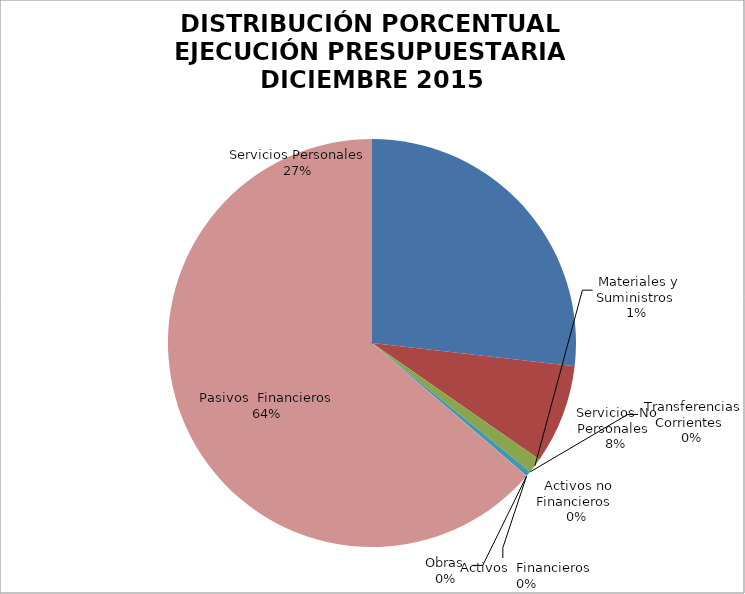
| Category | Series 0 | Series 1 |
|---|---|---|
| Servicios Personales | 19591606.44 | 0.268 |
| Servicios No Personales | 5734666.2 | 0.079 |
| Materiales y Suministros | 877055.89 | 0.012 |
| Transferencias Corrientes | 0 | 0 |
| Activos no Financieros | 312790.5 | 0.004 |
| Obras | 0 | 0 |
| Activos  Financieros | 14400 | 0 |
| Pasivos  Financieros | 46501688.57 | 0.637 |